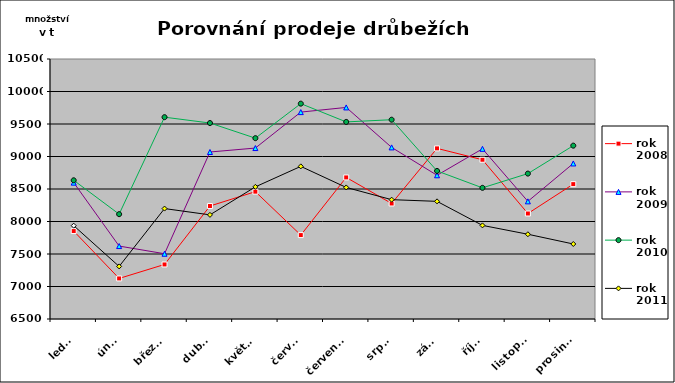
| Category | rok 2008 | rok 2009 | rok 2010 | rok 2011 |
|---|---|---|---|---|
| leden | 7853 | 8598 | 8634 | 7936 |
| únor | 7124 | 7622 | 8113 | 7309 |
| březen | 7339 | 7504 | 9605 | 8199 |
| duben | 8238 | 9069 | 9515 | 8102 |
| květen | 8459 | 9130 | 9282 | 8533 |
| červen | 7791 | 9683 | 9813 | 8848 |
| červenec | 8678 | 9755 | 9532 | 8524 |
| srpen | 8277 | 9140 | 9566 | 8336 |
| září | 9125 | 8711 | 8778 | 8310 |
| říjen | 8950 | 9118 | 8518 | 7940 |
| listopad | 8123 | 8310 | 8737 | 7804 |
| prosinec | 8575 | 8893 | 9167 | 7654 |